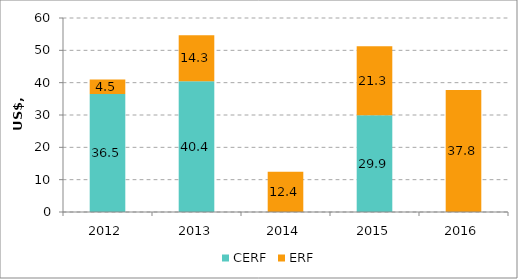
| Category | CERF | ERF |
|---|---|---|
| 2012.0 | 36.477 | 4.475 |
| 2013.0 | 40.404 | 14.255 |
| 2014.0 | 0 | 12.411 |
| 2015.0 | 29.926 | 21.333 |
| 2016.0 | 0 | 37.757 |